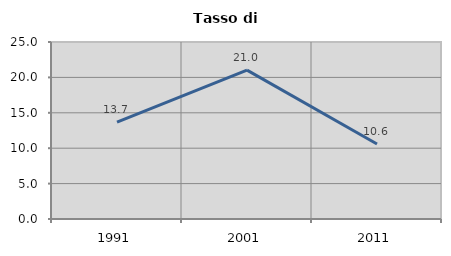
| Category | Tasso di disoccupazione   |
|---|---|
| 1991.0 | 13.681 |
| 2001.0 | 21.034 |
| 2011.0 | 10.584 |